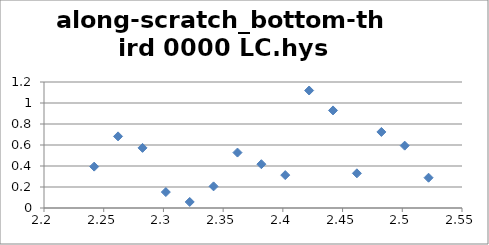
| Category | along-scratch_bottom-third 0000 LC.hys |
|---|---|
| 2.242001000000002 | 0.394 |
| 2.262001000000012 | 0.682 |
| 2.28250100000001 | 0.573 |
| 2.302001000000004 | 0.152 |
| 2.322001 | 0.058 |
| 2.34200100000001 | 0.206 |
| 2.362001000000006 | 0.528 |
| 2.382001000000002 | 0.417 |
| 2.402001000000013 | 0.313 |
| 2.422001000000009 | 1.119 |
| 2.442001000000005 | 0.929 |
| 2.462001000000001 | 0.33 |
| 2.482501000000013 | 0.724 |
| 2.502001000000007 | 0.594 |
| 2.522001000000003 | 0.289 |